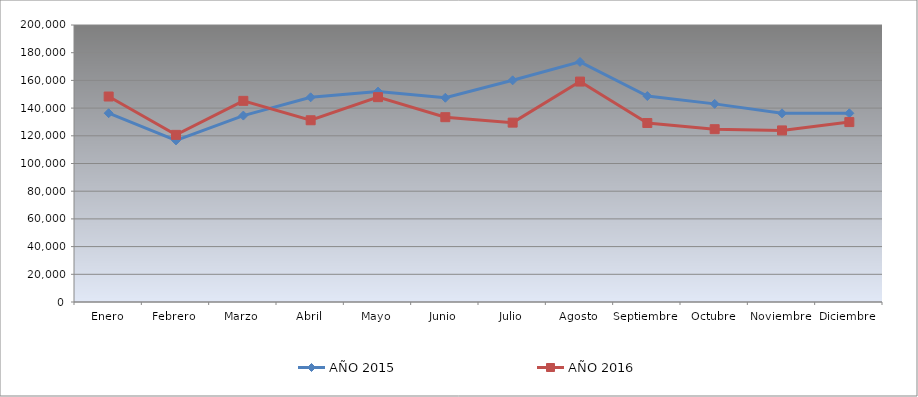
| Category | AÑO 2015 | AÑO 2016 |
|---|---|---|
| Enero | 136319.861 | 148355.657 |
| Febrero | 116673.996 | 120686.609 |
| Marzo | 134609.424 | 145235.535 |
| Abril | 147778.942 | 131219.158 |
| Mayo | 151929.138 | 147904.62 |
| Junio | 147470.464 | 133443.8 |
| Julio | 160055.158 | 129508.266 |
| Agosto | 173349.235 | 159151.328 |
| Septiembre | 148687.579 | 129242.755 |
| Octubre | 143044.129 | 124770.481 |
| Noviembre | 136227.444 | 123893.523 |
| Diciembre | 136245.379 | 129900.555 |